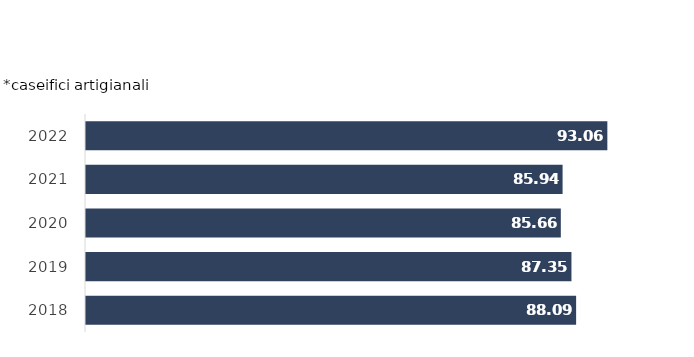
| Category | Series 2 | Series 1 |
|---|---|---|
| 2018.0 |  | 88.094 |
| 2019.0 |  | 87.352 |
| 2020.0 |  | 85.661 |
| 2021.0 |  | 85.941 |
| 2022.0 |  | 93.059 |